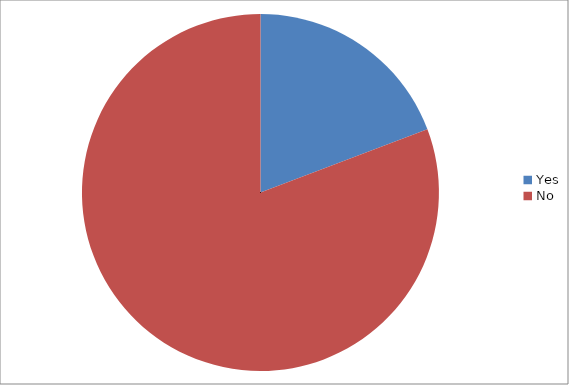
| Category | Series 0 |
|---|---|
| Yes | 5 |
| No | 21 |